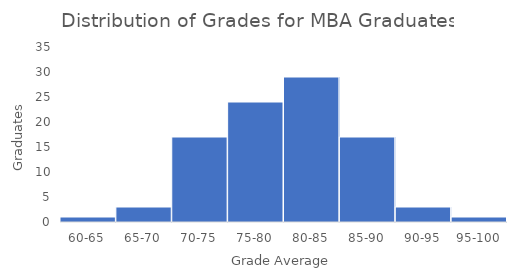
| Category | Total |
|---|---|
| 60-65 | 1 |
| 65-70 | 3 |
| 70-75 | 17 |
| 75-80 | 24 |
| 80-85 | 29 |
| 85-90 | 17 |
| 90-95 | 3 |
| 95-100 | 1 |